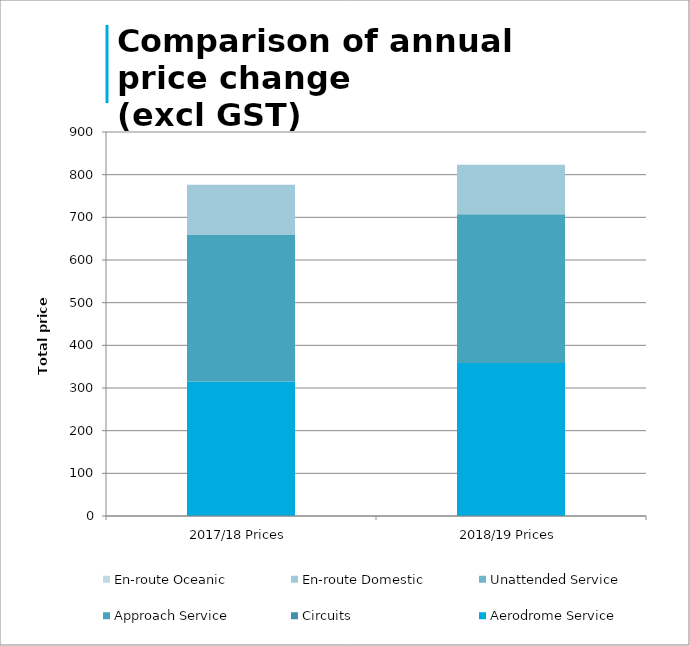
| Category | Aerodrome Service | Circuits | Approach Service | Unattended Service | En-route Domestic | En-route Oceanic |
|---|---|---|---|---|---|---|
| 2017/18 Prices | 315.31 | 0 | 343.5 | 0 | 117.41 | 0 |
| 2018/19 Prices | 358.37 | 0 | 348.79 | 0 | 116.14 | 0 |